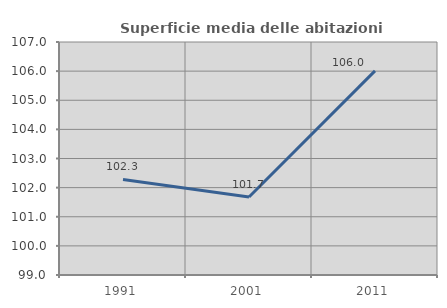
| Category | Superficie media delle abitazioni occupate |
|---|---|
| 1991.0 | 102.28 |
| 2001.0 | 101.676 |
| 2011.0 | 106.008 |